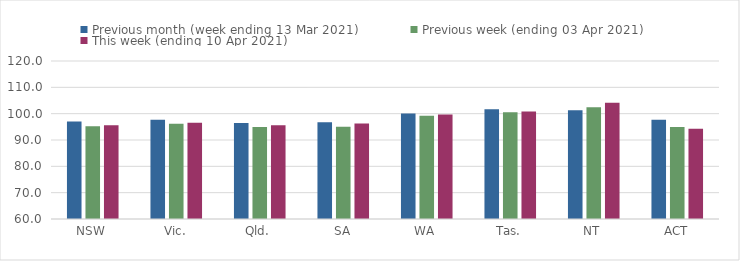
| Category | Previous month (week ending 13 Mar 2021) | Previous week (ending 03 Apr 2021) | This week (ending 10 Apr 2021) |
|---|---|---|---|
| NSW | 96.98 | 95.25 | 95.64 |
| Vic. | 97.73 | 96.19 | 96.56 |
| Qld. | 96.46 | 94.96 | 95.61 |
| SA | 96.7 | 95 | 96.27 |
| WA | 100.03 | 99.19 | 99.68 |
| Tas. | 101.63 | 100.55 | 100.84 |
| NT | 101.33 | 102.42 | 104.19 |
| ACT | 97.65 | 94.93 | 94.26 |